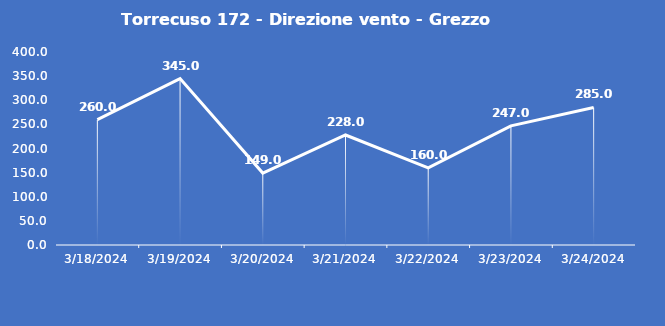
| Category | Torrecuso 172 - Direzione vento - Grezzo (°N) |
|---|---|
| 3/18/24 | 260 |
| 3/19/24 | 345 |
| 3/20/24 | 149 |
| 3/21/24 | 228 |
| 3/22/24 | 160 |
| 3/23/24 | 247 |
| 3/24/24 | 285 |